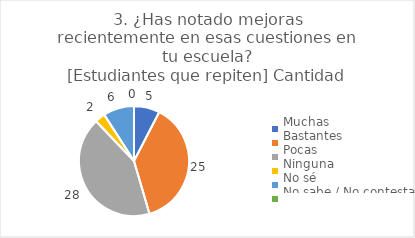
| Category | 3. ¿Has notado mejoras recientemente en esas cuestiones en tu escuela?
[Estudiantes que repiten] |
|---|---|
| Muchas  | 0.076 |
| Bastantes  | 0.379 |
| Pocas  | 0.424 |
| Ninguna  | 0.03 |
| No sé  | 0.091 |
| No sabe / No contesta | 0 |